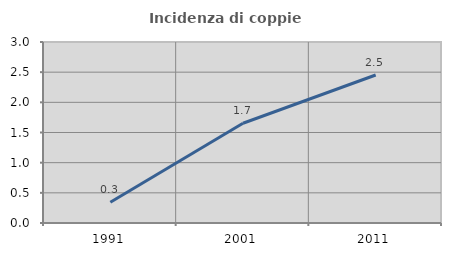
| Category | Incidenza di coppie miste |
|---|---|
| 1991.0 | 0.344 |
| 2001.0 | 1.653 |
| 2011.0 | 2.453 |